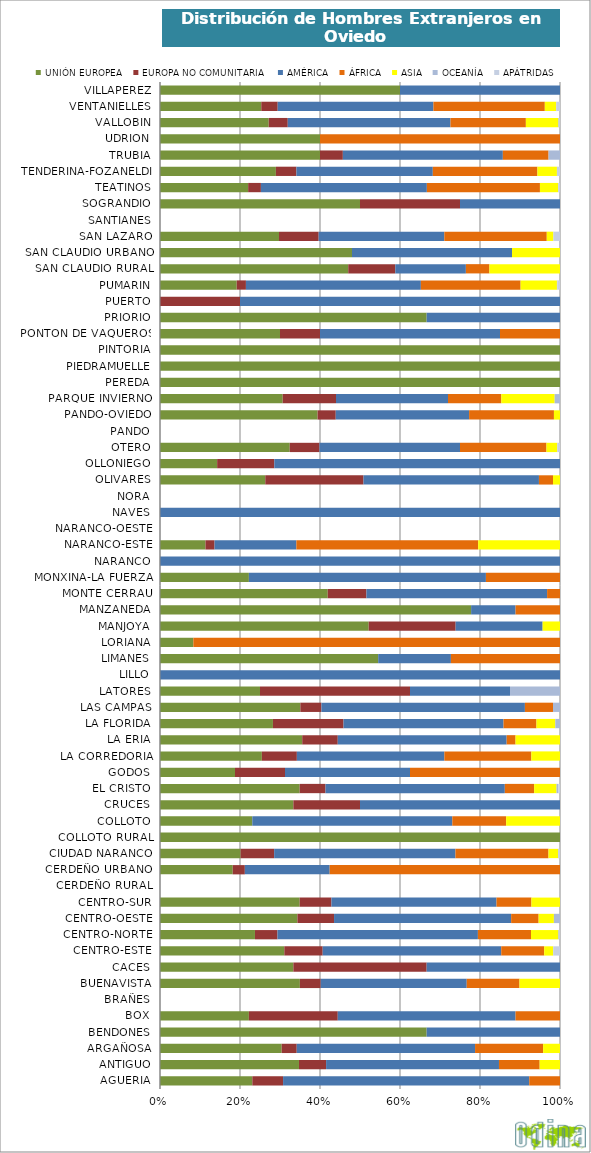
| Category | UNIÓN EUROPEA | EUROPA NO COMUNITARIA | AMÉRICA | ÁFRICA | ASIA | OCEANÍA | APÁTRIDAS |
|---|---|---|---|---|---|---|---|
| AGUERIA | 0.231 | 0.077 | 0.615 | 0.077 | 0 | 0 | 0 |
| ANTIGUO | 0.347 | 0.068 | 0.432 | 0.102 | 0.051 | 0 | 0 |
| ARGAÑOSA | 0.304 | 0.038 | 0.446 | 0.17 | 0.042 | 0 | 0 |
| BENDONES | 0.667 | 0 | 0.333 | 0 | 0 | 0 | 0 |
| BOX | 0.222 | 0.222 | 0.444 | 0.111 | 0 | 0 | 0 |
| BRAÑES | 0 | 0 | 0 | 0 | 0 | 0 | 0 |
| BUENAVISTA | 0.35 | 0.052 | 0.365 | 0.132 | 0.101 | 0 | 0 |
| CACES | 0.333 | 0.333 | 0.333 | 0 | 0 | 0 | 0 |
| CENTRO-ESTE | 0.311 | 0.096 | 0.446 | 0.107 | 0.023 | 0 | 0.017 |
| CENTRO-NORTE | 0.237 | 0.056 | 0.501 | 0.133 | 0.068 | 0.002 | 0.002 |
| CENTRO-OESTE | 0.344 | 0.092 | 0.443 | 0.069 | 0.038 | 0.015 | 0 |
| CENTRO-SUR | 0.349 | 0.079 | 0.413 | 0.087 | 0.071 | 0 | 0 |
| CERDEÑO RURAL | 0 | 0 | 0 | 0 | 0 | 0 | 0 |
| CERDEÑO URBANO | 0.182 | 0.03 | 0.212 | 0.576 | 0 | 0 | 0 |
| CIUDAD NARANCO | 0.201 | 0.084 | 0.453 | 0.233 | 0.024 | 0 | 0.005 |
| COLLOTO RURAL | 1 | 0 | 0 | 0 | 0 | 0 | 0 |
| COLLOTO | 0.231 | 0 | 0.5 | 0.135 | 0.135 | 0 | 0 |
| CRUCES | 0.333 | 0.167 | 0.5 | 0 | 0 | 0 | 0 |
| EL CRISTO | 0.349 | 0.065 | 0.448 | 0.073 | 0.056 | 0.004 | 0.004 |
| GODOS | 0.188 | 0.125 | 0.312 | 0.375 | 0 | 0 | 0 |
| LA CORREDORIA | 0.254 | 0.087 | 0.368 | 0.217 | 0.071 | 0 | 0 |
| LA ERIA | 0.356 | 0.089 | 0.422 | 0.022 | 0.111 | 0 | 0 |
| LA FLORIDA | 0.282 | 0.176 | 0.4 | 0.082 | 0.047 | 0.012 | 0 |
| LAS CAMPAS | 0.351 | 0.053 | 0.509 | 0.07 | 0 | 0.018 | 0 |
| LATORES | 0.25 | 0.375 | 0.25 | 0 | 0 | 0.125 | 0 |
| LILLO | 0 | 0 | 1 | 0 | 0 | 0 | 0 |
| LIMANES | 0.545 | 0 | 0.182 | 0.273 | 0 | 0 | 0 |
| LORIANA | 0.083 | 0 | 0 | 0.917 | 0 | 0 | 0 |
| MANJOYA | 0.522 | 0.217 | 0.217 | 0 | 0.043 | 0 | 0 |
| MANZANEDA | 0.778 | 0 | 0.111 | 0.111 | 0 | 0 | 0 |
| MONTE CERRAU | 0.419 | 0.097 | 0.452 | 0.032 | 0 | 0 | 0 |
| MONXINA-LA FUERZA | 0.222 | 0 | 0.593 | 0.185 | 0 | 0 | 0 |
| NARANCO | 0 | 0 | 1 | 0 | 0 | 0 | 0 |
| NARANCO-ESTE | 0.114 | 0.023 | 0.205 | 0.455 | 0.205 | 0 | 0 |
| NARANCO-OESTE | 0 | 0 | 0 | 0 | 0 | 0 | 0 |
| NAVES | 0 | 0 | 1 | 0 | 0 | 0 | 0 |
| NORA | 0 | 0 | 0 | 0 | 0 | 0 | 0 |
| OLIVARES | 0.263 | 0.246 | 0.439 | 0.035 | 0.018 | 0 | 0 |
| OLLONIEGO | 0.143 | 0.143 | 0.714 | 0 | 0 | 0 | 0 |
| OTERO | 0.324 | 0.074 | 0.351 | 0.216 | 0.027 | 0 | 0.007 |
| PANDO | 0 | 0 | 0 | 0 | 0 | 0 | 0 |
| PANDO-OVIEDO | 0.394 | 0.045 | 0.333 | 0.212 | 0.015 | 0 | 0 |
| PARQUE INVIERNO | 0.307 | 0.133 | 0.28 | 0.133 | 0.133 | 0.013 | 0 |
| PEREDA | 1 | 0 | 0 | 0 | 0 | 0 | 0 |
| PIEDRAMUELLE | 1 | 0 | 0 | 0 | 0 | 0 | 0 |
| PINTORIA | 1 | 0 | 0 | 0 | 0 | 0 | 0 |
| PONTON DE VAQUEROS | 0.3 | 0.1 | 0.45 | 0.15 | 0 | 0 | 0 |
| PRIORIO | 0.667 | 0 | 0.333 | 0 | 0 | 0 | 0 |
| PUERTO | 0 | 0.2 | 0.8 | 0 | 0 | 0 | 0 |
| PUMARIN | 0.192 | 0.023 | 0.437 | 0.249 | 0.091 | 0.001 | 0.006 |
| SAN CLAUDIO RURAL | 0.471 | 0.118 | 0.176 | 0.059 | 0.176 | 0 | 0 |
| SAN CLAUDIO URBANO | 0.48 | 0 | 0.4 | 0 | 0.12 | 0 | 0 |
| SAN LAZARO | 0.298 | 0.099 | 0.314 | 0.256 | 0.017 | 0 | 0.017 |
| SANTIANES | 0 | 0 | 0 | 0 | 0 | 0 | 0 |
| SOGRANDIO | 0.5 | 0.25 | 0.25 | 0 | 0 | 0 | 0 |
| TEATINOS | 0.22 | 0.032 | 0.415 | 0.283 | 0.046 | 0 | 0.005 |
| TENDERINA-FOZANELDI | 0.29 | 0.051 | 0.341 | 0.262 | 0.049 | 0 | 0.008 |
| TRUBIA | 0.4 | 0.057 | 0.4 | 0.114 | 0 | 0.029 | 0 |
| UDRION | 0.4 | 0 | 0 | 0.6 | 0 | 0 | 0 |
| VALLOBIN | 0.272 | 0.048 | 0.407 | 0.188 | 0.081 | 0.002 | 0.002 |
| VENTANIELLES | 0.253 | 0.041 | 0.389 | 0.278 | 0.028 | 0 | 0.009 |
| VILLAPEREZ | 0.6 | 0 | 0.4 | 0 | 0 | 0 | 0 |